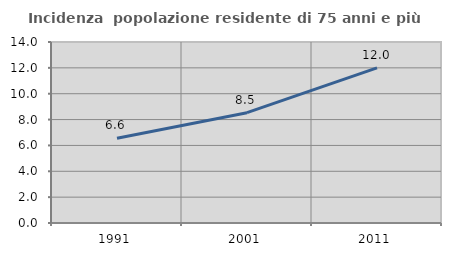
| Category | Incidenza  popolazione residente di 75 anni e più |
|---|---|
| 1991.0 | 6.551 |
| 2001.0 | 8.532 |
| 2011.0 | 11.998 |